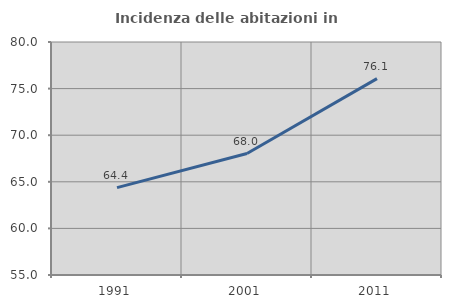
| Category | Incidenza delle abitazioni in proprietà  |
|---|---|
| 1991.0 | 64.372 |
| 2001.0 | 68.03 |
| 2011.0 | 76.075 |